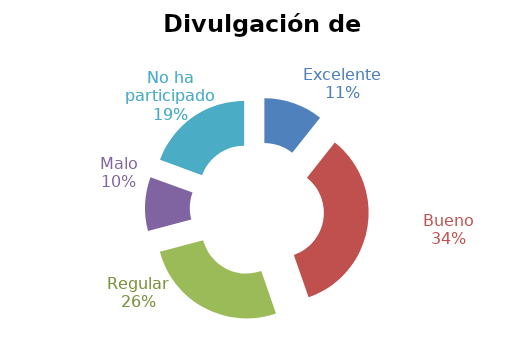
| Category | Series 0 |
|---|---|
| Excelente | 0.107 |
| Bueno | 0.34 |
| Regular | 0.262 |
| Malo | 0.097 |
| No ha participado | 0.194 |